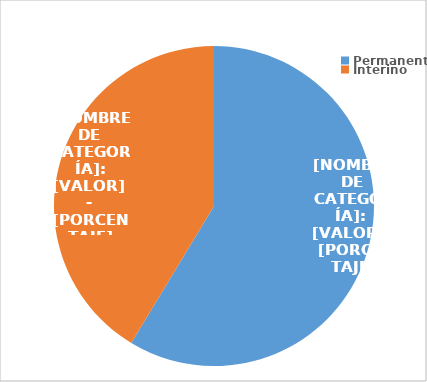
| Category | Series 0 |
|---|---|
| Permanente | 3248 |
| Interino | 2290 |